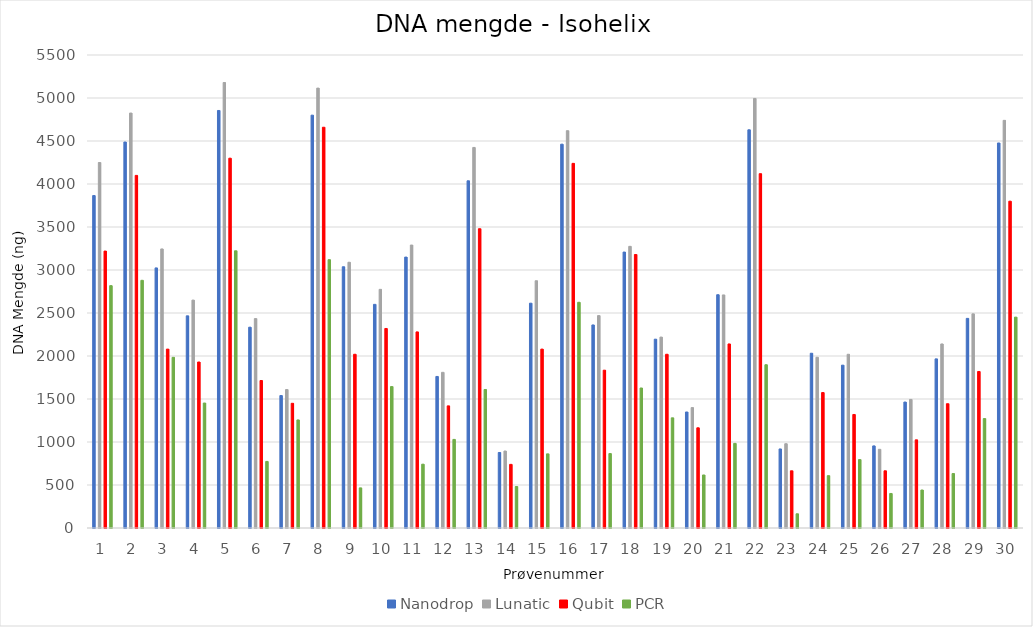
| Category | Nanodrop | Lunatic | Qubit | PCR |
|---|---|---|---|---|
| 1.0 | 3865.5 | 4250 | 3220 | 2818 |
| 2.0 | 4488 | 4825 | 4100 | 2880 |
| 3.0 | 3024.5 | 3245 | 2080 | 1984.5 |
| 4.0 | 2467 | 2650 | 1930 | 1453 |
| 5.0 | 4855 | 5180 | 4300 | 3223 |
| 6.0 | 2335 | 2435 | 1715 | 774 |
| 7.0 | 1540 | 1610 | 1450 | 1256.5 |
| 8.0 | 4800.5 | 5115 | 4660 | 3120 |
| 9.0 | 3037.5 | 3090 | 2020 | 466.5 |
| 10.0 | 2600.5 | 2775 | 2320 | 1644.5 |
| 11.0 | 3150 | 3290 | 2280 | 742 |
| 12.0 | 1762 | 1810 | 1420 | 1030 |
| 13.0 | 4037 | 4425 | 3480 | 1610.5 |
| 14.0 | 878 | 895 | 740 | 482.5 |
| 15.0 | 2614 | 2875 | 2080 | 862 |
| 16.0 | 4463 | 4620 | 4240 | 2624.5 |
| 17.0 | 2361 | 2470 | 1835 | 865.5 |
| 18.0 | 3208.5 | 3275 | 3180 | 1628 |
| 19.0 | 2195.5 | 2220 | 2020 | 1281 |
| 20.0 | 1349 | 1400 | 1165 | 616.5 |
| 21.0 | 2712.5 | 2710 | 2140 | 984 |
| 22.0 | 4630 | 4995 | 4120 | 1898.5 |
| 23.0 | 919 | 980 | 665 | 165 |
| 24.0 | 2032 | 1985 | 1575 | 608.5 |
| 25.0 | 1893.5 | 2020 | 1320 | 795.5 |
| 26.0 | 954.5 | 915 | 665 | 401.5 |
| 27.0 | 1464.5 | 1495 | 1025 | 441.5 |
| 28.0 | 1966.5 | 2140 | 1445 | 633 |
| 29.0 | 2437.5 | 2490 | 1820 | 1272.5 |
| 30.0 | 4477 | 4740 | 3800 | 2452 |